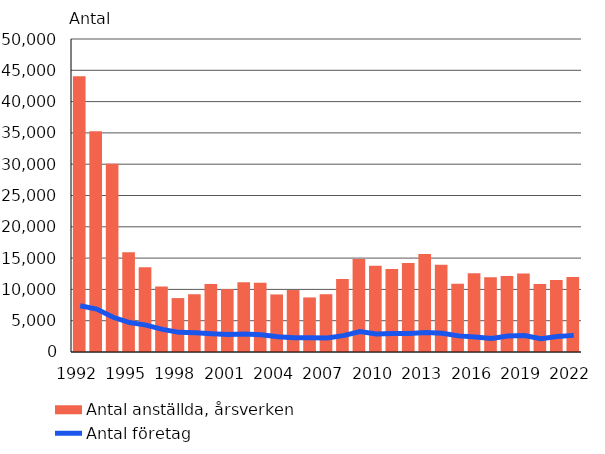
| Category | Antal anställda, årsverken |
|---|---|
| 1992.0 | 44050 |
| 1993.0 | 35282 |
| 1994.0 | 30052 |
| 1995.0 | 15922 |
| 1996.0 | 13551 |
| 1997.0 | 10473 |
| 1998.0 | 8612 |
| 1999.0 | 9226 |
| 2000.0 | 10849 |
| 2001.0 | 10047 |
| 2002.0 | 11126 |
| 2003.0 | 11061 |
| 2004.0 | 9191 |
| 2005.0 | 9898 |
| 2006.0 | 8717 |
| 2007.0 | 9230 |
| 2008.0 | 11660 |
| 2009.0 | 14860 |
| 2010.0 | 13759 |
| 2011.0 | 13270 |
| 2012.0 | 14206 |
| 2013.0 | 15637 |
| 2014.0 | 13951 |
| 2015.0 | 10902 |
| 2016.0 | 12580 |
| 2017.0 | 11943 |
| 2018.0 | 12127 |
| 2019.0 | 12548 |
| 2020.0 | 10876 |
| 2021.0 | 11490 |
| 2022.0 | 11975 |